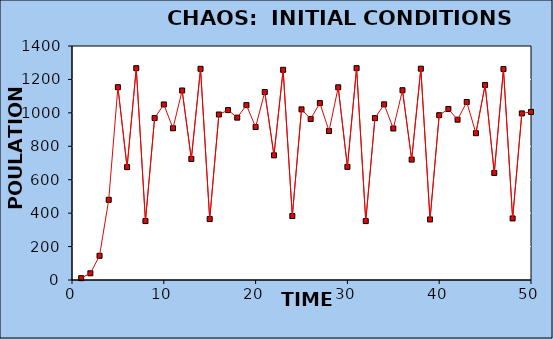
| Category | Series 0 |
|---|---|
| 1.0 | 11 |
| 2.0 | 40.373 |
| 3.0 | 144.98 |
| 4.0 | 479.675 |
| 5.0 | 1153.559 |
| 6.0 | 675.282 |
| 7.0 | 1267.328 |
| 8.0 | 352.59 |
| 9.0 | 968.919 |
| 10.0 | 1050.229 |
| 11.0 | 907.798 |
| 12.0 | 1133.79 |
| 13.0 | 724.227 |
| 14.0 | 1263.477 |
| 15.0 | 364.655 |
| 16.0 | 990.195 |
| 17.0 | 1016.409 |
| 18.0 | 971.377 |
| 19.0 | 1046.446 |
| 20.0 | 915.216 |
| 21.0 | 1124.724 |
| 22.0 | 745.968 |
| 23.0 | 1257.617 |
| 24.0 | 382.861 |
| 25.0 | 1020.813 |
| 26.0 | 963.448 |
| 27.0 | 1058.53 |
| 28.0 | 891.249 |
| 29.0 | 1152.945 |
| 30.0 | 676.835 |
| 31.0 | 1267.404 |
| 32.0 | 352.349 |
| 33.0 | 968.487 |
| 34.0 | 1050.892 |
| 35.0 | 906.492 |
| 36.0 | 1135.356 |
| 37.0 | 720.427 |
| 38.0 | 1264.239 |
| 39.0 | 362.273 |
| 40.0 | 986.058 |
| 41.0 | 1023.177 |
| 42.0 | 959.148 |
| 43.0 | 1064.942 |
| 44.0 | 878.212 |
| 45.0 | 1166.993 |
| 46.0 | 640.819 |
| 47.0 | 1262.278 |
| 48.0 | 368.395 |
| 49.0 | 996.632 |
| 50.0 | 1005.695 |